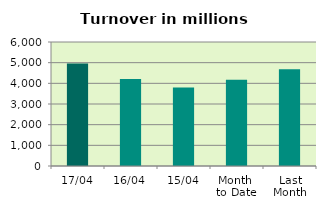
| Category | Series 0 |
|---|---|
| 17/04 | 4959.943 |
| 16/04 | 4203.841 |
| 15/04 | 3801.227 |
| Month 
to Date | 4178.427 |
| Last
Month | 4683.179 |